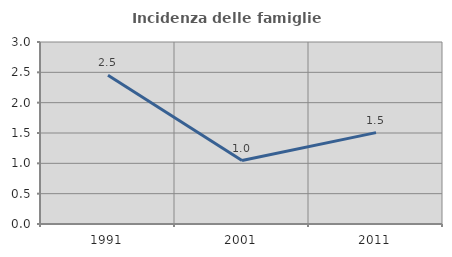
| Category | Incidenza delle famiglie numerose |
|---|---|
| 1991.0 | 2.452 |
| 2001.0 | 1.046 |
| 2011.0 | 1.506 |